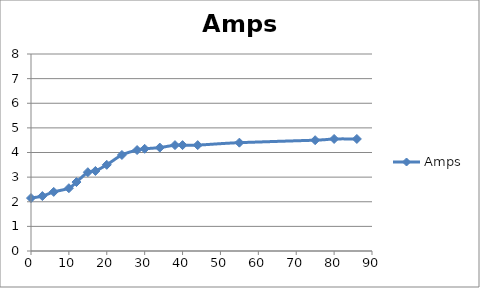
| Category | Amps |
|---|---|
| 0.0 | 2.15 |
| 3.0 | 2.23 |
| 6.0 | 2.4 |
| 10.0 | 2.55 |
| 12.0 | 2.8 |
| 15.0 | 3.2 |
| 17.0 | 3.25 |
| 20.0 | 3.5 |
| 24.0 | 3.9 |
| 28.0 | 4.1 |
| 30.0 | 4.15 |
| 34.0 | 4.2 |
| 38.0 | 4.3 |
| 40.0 | 4.3 |
| 44.0 | 4.3 |
| 55.0 | 4.4 |
| 75.0 | 4.5 |
| 80.0 | 4.55 |
| 86.0 | 4.55 |